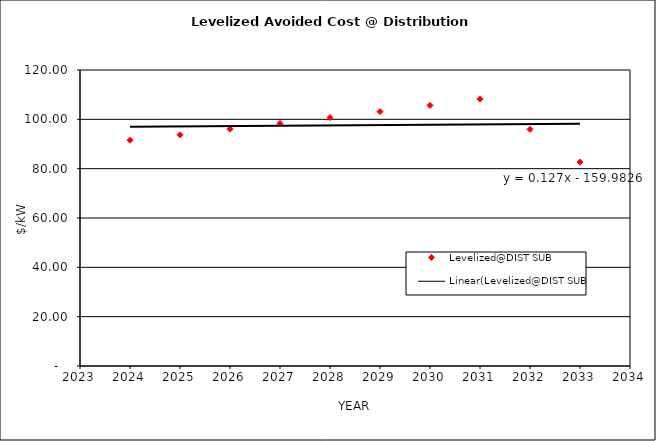
| Category | Levelized@DIST SUB |
|---|---|
| 2024.0 | 91.529 |
| 2025.0 | 93.742 |
| 2026.0 | 96.01 |
| 2027.0 | 98.332 |
| 2028.0 | 100.71 |
| 2029.0 | 103.147 |
| 2030.0 | 105.642 |
| 2031.0 | 108.197 |
| 2032.0 | 95.923 |
| 2033.0 | 82.682 |